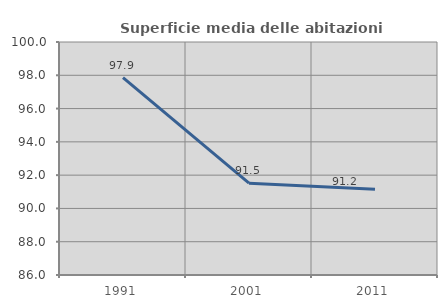
| Category | Superficie media delle abitazioni occupate |
|---|---|
| 1991.0 | 97.857 |
| 2001.0 | 91.515 |
| 2011.0 | 91.154 |